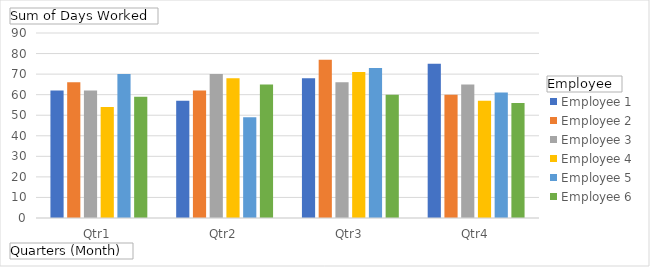
| Category | Employee 1 | Employee 2 | Employee 3 | Employee 4 | Employee 5 | Employee 6 |
|---|---|---|---|---|---|---|
| Qtr1 | 62 | 66 | 62 | 54 | 70 | 59 |
| Qtr2 | 57 | 62 | 70 | 68 | 49 | 65 |
| Qtr3 | 68 | 77 | 66 | 71 | 73 | 60 |
| Qtr4 | 75 | 60 | 65 | 57 | 61 | 56 |